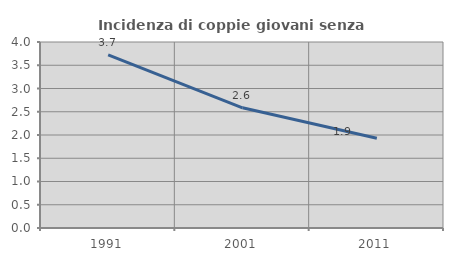
| Category | Incidenza di coppie giovani senza figli |
|---|---|
| 1991.0 | 3.723 |
| 2001.0 | 2.584 |
| 2011.0 | 1.928 |